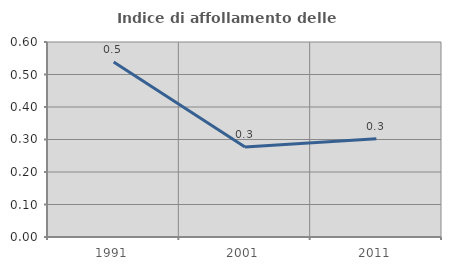
| Category | Indice di affollamento delle abitazioni  |
|---|---|
| 1991.0 | 0.539 |
| 2001.0 | 0.277 |
| 2011.0 | 0.303 |